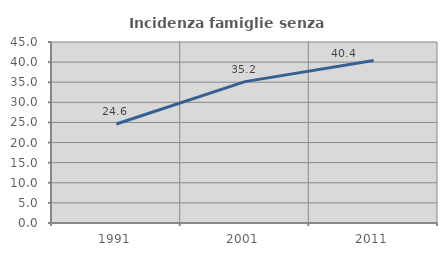
| Category | Incidenza famiglie senza nuclei |
|---|---|
| 1991.0 | 24.622 |
| 2001.0 | 35.152 |
| 2011.0 | 40.423 |